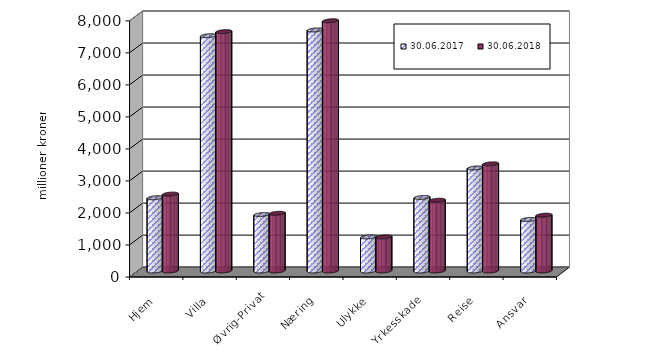
| Category | 30.06.2017 | 30.06.2018 |
|---|---|---|
| Hjem | 2288.262 | 2401.954 |
| Villa | 7349.498 | 7476.186 |
| Øvrig-Privat | 1763.205 | 1803.319 |
| Næring | 7529.743 | 7816.002 |
| Ulykke | 1066.059 | 1065.456 |
| Yrkesskade | 2296.508 | 2209.824 |
| Reise | 3218.051 | 3346.59 |
| Ansvar | 1610.814 | 1742.572 |